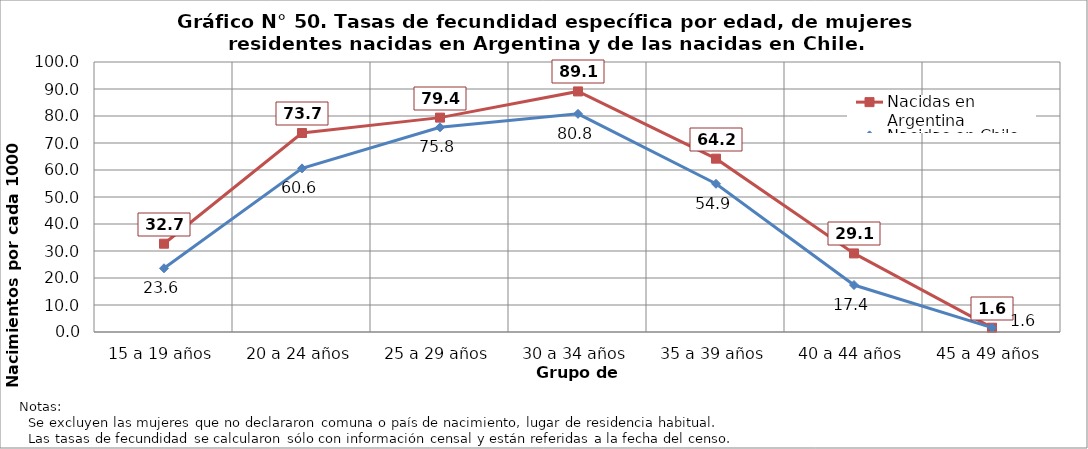
| Category | Nacidas en Argentina | Nacidas en Chile |
|---|---|---|
| 15 a 19 años | 32.7 | 23.6 |
| 20 a 24 años | 73.7 | 60.6 |
| 25 a 29 años | 79.4 | 75.8 |
| 30 a 34 años | 89.1 | 80.8 |
| 35 a 39 años | 64.2 | 54.9 |
| 40 a 44 años | 29.1 | 17.4 |
| 45 a 49 años | 1.6 | 1.6 |